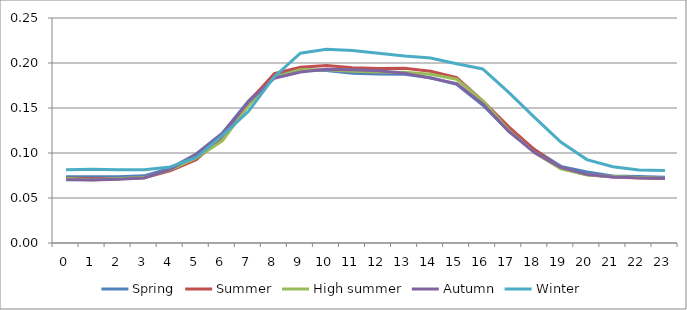
| Category | Spring | Summer | High summer | Autumn | Winter |
|---|---|---|---|---|---|
| 0.0 | 0.074 | 0.072 | 0.072 | 0.07 | 0.081 |
| 1.0 | 0.074 | 0.071 | 0.07 | 0.07 | 0.082 |
| 2.0 | 0.074 | 0.072 | 0.072 | 0.071 | 0.081 |
| 3.0 | 0.075 | 0.072 | 0.073 | 0.072 | 0.081 |
| 4.0 | 0.083 | 0.08 | 0.081 | 0.082 | 0.084 |
| 5.0 | 0.099 | 0.093 | 0.094 | 0.098 | 0.095 |
| 6.0 | 0.122 | 0.118 | 0.113 | 0.121 | 0.119 |
| 7.0 | 0.158 | 0.156 | 0.152 | 0.157 | 0.146 |
| 8.0 | 0.186 | 0.188 | 0.184 | 0.183 | 0.185 |
| 9.0 | 0.192 | 0.195 | 0.192 | 0.19 | 0.211 |
| 10.0 | 0.192 | 0.197 | 0.193 | 0.193 | 0.215 |
| 11.0 | 0.189 | 0.195 | 0.191 | 0.193 | 0.214 |
| 12.0 | 0.188 | 0.194 | 0.19 | 0.191 | 0.211 |
| 13.0 | 0.187 | 0.194 | 0.19 | 0.189 | 0.208 |
| 14.0 | 0.184 | 0.191 | 0.188 | 0.183 | 0.206 |
| 15.0 | 0.176 | 0.184 | 0.182 | 0.177 | 0.199 |
| 16.0 | 0.153 | 0.158 | 0.158 | 0.155 | 0.193 |
| 17.0 | 0.124 | 0.129 | 0.125 | 0.124 | 0.167 |
| 18.0 | 0.104 | 0.104 | 0.1 | 0.1 | 0.139 |
| 19.0 | 0.085 | 0.083 | 0.082 | 0.084 | 0.112 |
| 20.0 | 0.079 | 0.076 | 0.076 | 0.076 | 0.093 |
| 21.0 | 0.075 | 0.073 | 0.074 | 0.073 | 0.085 |
| 22.0 | 0.074 | 0.072 | 0.073 | 0.072 | 0.081 |
| 23.0 | 0.073 | 0.072 | 0.072 | 0.072 | 0.08 |